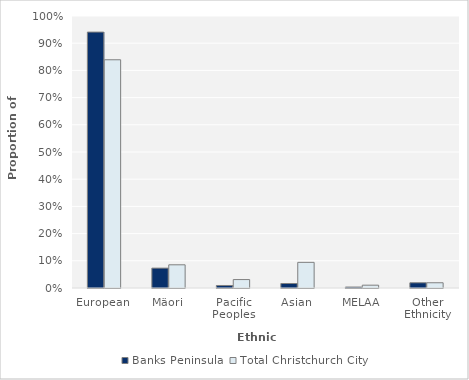
| Category | Banks Peninsula | Total Christchurch City |
|---|---|---|
| European | 0.941 | 0.839 |
| Mäori | 0.073 | 0.085 |
| Pacific Peoples | 0.009 | 0.031 |
| Asian | 0.017 | 0.094 |
| MELAA | 0.003 | 0.01 |
| Other Ethnicity | 0.019 | 0.019 |